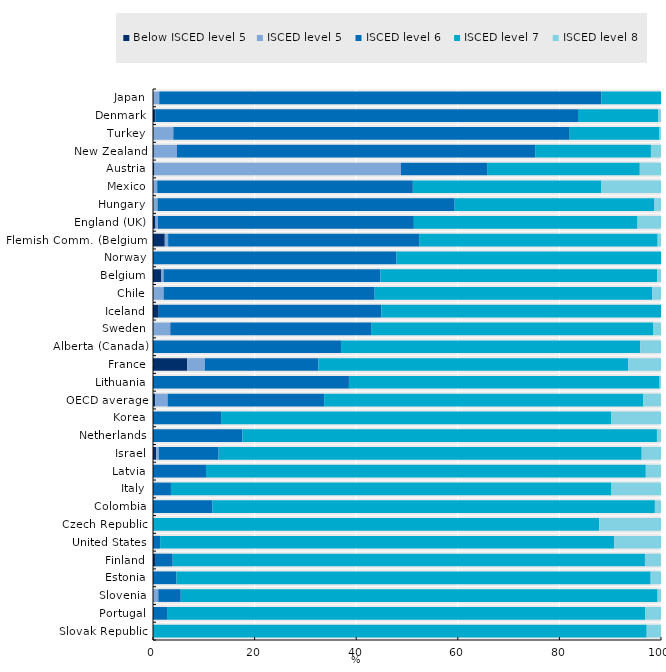
| Category | Below ISCED level 5 | ISCED level 5 | ISCED level 6 | ISCED level 7 | ISCED level 8 |
|---|---|---|---|---|---|
| Slovak Republic | 0 | 0 | 0 | 97.182 | 2.818 |
| Portugal | 0 | 0 | 2.769 | 94.168 | 3.063 |
| Slovenia | 0 | 1.042 | 4.418 | 93.865 | 0.675 |
| Estonia | 0 | 0 | 4.609 | 93.354 | 2.036 |
| Finland | 0.539 | 0 | 3.337 | 92.96 | 3.163 |
| United States | 0 | 0 | 1.404 | 89.405 | 9.191 |
| Czech Republic | 0 | 0 | 0 | 87.834 | 12.166 |
| Colombia | 0 | 0 | 11.691 | 87.102 | 1.207 |
| Italy | 0 | 0 | 3.532 | 86.706 | 9.762 |
| Latvia | 0 | 0 | 10.44 | 86.567 | 2.992 |
| Israel | 0.606 | 0.543 | 11.757 | 83.291 | 3.803 |
| Netherlands | 0 | 0 | 17.6 | 81.6 | 0.8 |
| Korea | 0 | 0 | 13.401 | 76.755 | 9.844 |
| OECD average | 0.416 | 2.465 | 30.812 | 62.824 | 3.483 |
| Lithuania | 0 | 0 | 38.568 | 61.155 | 0.277 |
| France | 6.729 | 3.474 | 22.345 | 61.028 | 6.424 |
| Alberta (Canada) | 0 | 0 | 37.002 | 58.879 | 4.119 |
| Sweden | 0 | 3.406 | 39.633 | 55.388 | 1.573 |
| Iceland | 1.124 | 0 | 43.82 | 55.056 | 0 |
| Chile | 0 | 2.091 | 41.541 | 54.615 | 1.753 |
| Belgium | 1.66 | 0.411 | 42.707 | 54.496 | 0.727 |
| Norway | 0 | 0 | 47.933 | 52.067 | 0 |
| Flemish Comm. (Belgium) | 2.317 | 0.666 | 49.409 | 46.948 | 0.661 |
| England (UK) | 0.496 | 0.469 | 50.383 | 44.029 | 4.624 |
| Hungary | 0 | 0.895 | 58.488 | 39.335 | 1.282 |
| Mexico | 0 | 0.832 | 50.32 | 37.121 | 11.728 |
| Austria | 0.285 | 48.527 | 17.059 | 29.95 | 4.179 |
| New Zealand | 0.142 | 4.575 | 70.509 | 22.79 | 1.984 |
| Turkey | 0 | 4.003 | 78.026 | 17.667 | 0.304 |
| Denmark | 0.471 | 0 | 83.194 | 15.816 | 0.518 |
| Japan | 0 | 1.232 | 87.05 | 11.718 | 0 |